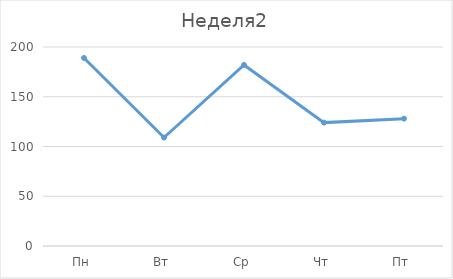
| Category | Неделя2 |
|---|---|
| Пн | 189 |
| Вт | 109 |
| Ср | 182 |
| Чт | 124 |
| Пт | 128 |